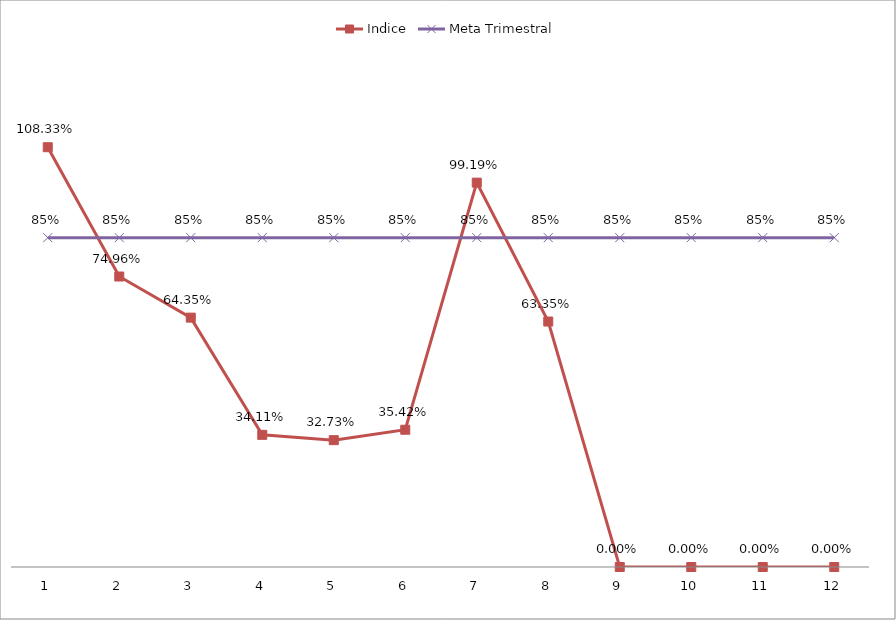
| Category | Indice | Meta Trimestral |
|---|---|---|
| 0 | 1.083 | 0.85 |
| 1 | 0.75 | 0.85 |
| 2 | 0.644 | 0.85 |
| 3 | 0.341 | 0.85 |
| 4 | 0.327 | 0.85 |
| 5 | 0.354 | 0.85 |
| 6 | 0.992 | 0.85 |
| 7 | 0.633 | 0.85 |
| 8 | 0 | 0.85 |
| 9 | 0 | 0.85 |
| 10 | 0 | 0.85 |
| 11 | 0 | 0.85 |